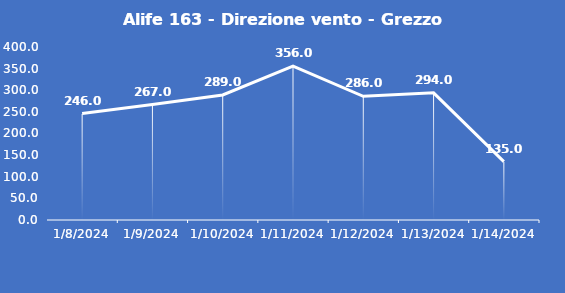
| Category | Alife 163 - Direzione vento - Grezzo (°N) |
|---|---|
| 1/8/24 | 246 |
| 1/9/24 | 267 |
| 1/10/24 | 289 |
| 1/11/24 | 356 |
| 1/12/24 | 286 |
| 1/13/24 | 294 |
| 1/14/24 | 135 |